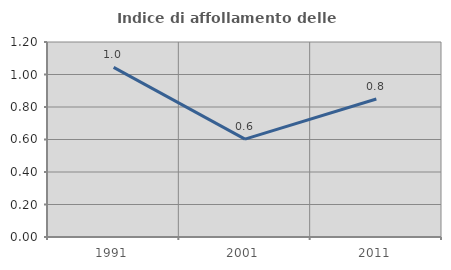
| Category | Indice di affollamento delle abitazioni  |
|---|---|
| 1991.0 | 1.044 |
| 2001.0 | 0.602 |
| 2011.0 | 0.849 |